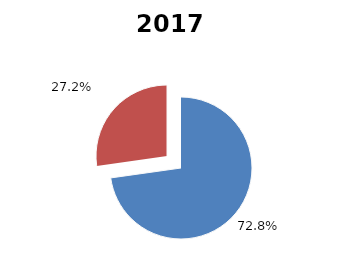
| Category | 2017 |
|---|---|
| Recaudación gestión directa | 2679701.307 |
| Ajustes fiscales | 1002969.805 |